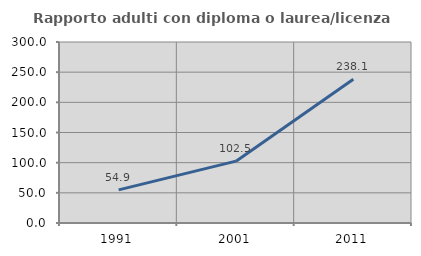
| Category | Rapporto adulti con diploma o laurea/licenza media  |
|---|---|
| 1991.0 | 54.902 |
| 2001.0 | 102.5 |
| 2011.0 | 238.136 |